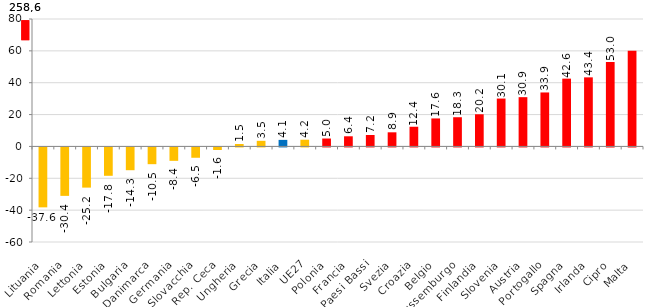
| Category | Series 0 |
|---|---|
| Lituania | -37.617 |
| Romania | -30.414 |
| Lettonia | -25.23 |
| Estonia | -17.809 |
| Bulgaria | -14.299 |
| Danimarca | -10.516 |
| Germania | -8.424 |
| Slovacchia | -6.491 |
| Rep. Ceca | -1.627 |
| Ungheria | 1.534 |
| Grecia | 3.522 |
| Italia | 4.107 |
| UE27 | 4.205 |
| Polonia | 4.966 |
| Francia | 6.363 |
| Paesi Bassi | 7.193 |
| Svezia | 8.864 |
| Croazia | 12.355 |
| Belgio | 17.571 |
| Lussemburgo | 18.331 |
| Finlandia | 20.184 |
| Slovenia | 30.056 |
| Austria | 30.928 |
| Portogallo | 33.885 |
| Spagna | 42.564 |
| Irlanda | 43.363 |
| Cipro | 52.957 |
| Malta | 60 |